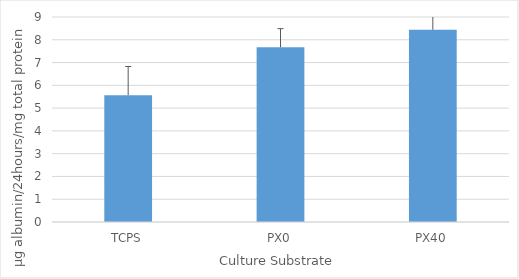
| Category | ug Albumin/24hrs/mg total protein |
|---|---|
| TCPS | 5.568 |
| PX0 | 7.671 |
| PX40 | 8.438 |